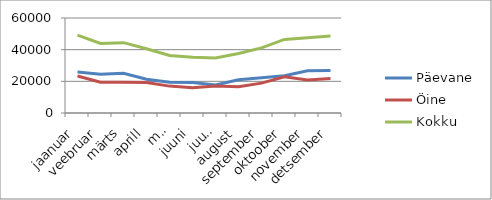
| Category | Päevane | Öine | Kokku |
|---|---|---|---|
| jaanuar | 25848.3 | 23322.6 | 49170.9 |
| veebruar | 24500.7 | 19402 | 43902.7 |
| märts | 25038.1 | 19384.1 | 44422.2 |
| aprill | 21363.6 | 19243.6 | 40607.2 |
| mai | 19364.7 | 16984 | 36348.7 |
| juuni | 19227.7 | 15911 | 35138.7 |
| juuli | 17763.822 | 17041.485 | 34805.307 |
| august | 20983.103 | 16598.743 | 37581.846 |
| september | 22249.303 | 18867.469 | 41116.772 |
| oktoober | 23564.771 | 22907.039 | 46471.81 |
| november | 26724.466 | 20815.992 | 47540.458 |
| detsember | 26808.616 | 21792.746 | 48601.362 |